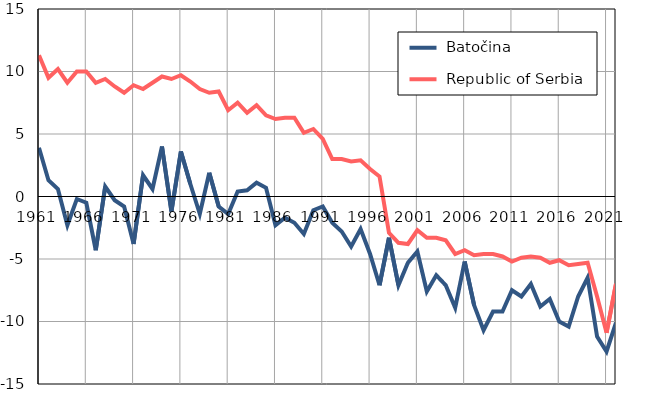
| Category |  Batočina |  Republic of Serbia |
|---|---|---|
| 1961.0 | 3.9 | 11.3 |
| 1962.0 | 1.3 | 9.5 |
| 1963.0 | 0.6 | 10.2 |
| 1964.0 | -2.3 | 9.1 |
| 1965.0 | -0.2 | 10 |
| 1966.0 | -0.5 | 10 |
| 1967.0 | -4.3 | 9.1 |
| 1968.0 | 0.8 | 9.4 |
| 1969.0 | -0.3 | 8.8 |
| 1970.0 | -0.8 | 8.3 |
| 1971.0 | -3.8 | 8.9 |
| 1972.0 | 1.7 | 8.6 |
| 1973.0 | 0.6 | 9.1 |
| 1974.0 | 4 | 9.6 |
| 1975.0 | -1.2 | 9.4 |
| 1976.0 | 3.6 | 9.7 |
| 1977.0 | 1 | 9.2 |
| 1978.0 | -1.4 | 8.6 |
| 1979.0 | 1.9 | 8.3 |
| 1980.0 | -0.8 | 8.4 |
| 1981.0 | -1.4 | 6.9 |
| 1982.0 | 0.4 | 7.5 |
| 1983.0 | 0.5 | 6.7 |
| 1984.0 | 1.1 | 7.3 |
| 1985.0 | 0.7 | 6.5 |
| 1986.0 | -2.3 | 6.2 |
| 1987.0 | -1.7 | 6.3 |
| 1988.0 | -2.1 | 6.3 |
| 1989.0 | -3 | 5.1 |
| 1990.0 | -1.1 | 5.4 |
| 1991.0 | -0.8 | 4.6 |
| 1992.0 | -2.1 | 3 |
| 1993.0 | -2.8 | 3 |
| 1994.0 | -4 | 2.8 |
| 1995.0 | -2.6 | 2.9 |
| 1996.0 | -4.6 | 2.2 |
| 1997.0 | -7.1 | 1.6 |
| 1998.0 | -3.3 | -2.9 |
| 1999.0 | -7.1 | -3.7 |
| 2000.0 | -5.3 | -3.8 |
| 2001.0 | -4.4 | -2.7 |
| 2002.0 | -7.6 | -3.3 |
| 2003.0 | -6.3 | -3.3 |
| 2004.0 | -7.1 | -3.5 |
| 2005.0 | -8.9 | -4.6 |
| 2006.0 | -5.2 | -4.3 |
| 2007.0 | -8.7 | -4.7 |
| 2008.0 | -10.7 | -4.6 |
| 2009.0 | -9.2 | -4.6 |
| 2010.0 | -9.2 | -4.8 |
| 2011.0 | -7.5 | -5.2 |
| 2012.0 | -8 | -4.9 |
| 2013.0 | -7 | -4.8 |
| 2014.0 | -8.8 | -4.9 |
| 2015.0 | -8.2 | -5.3 |
| 2016.0 | -10 | -5.1 |
| 2017.0 | -10.4 | -5.5 |
| 2018.0 | -8 | -5.4 |
| 2019.0 | -6.5 | -5.3 |
| 2020.0 | -11.2 | -8 |
| 2021.0 | -12.4 | -10.9 |
| 2022.0 | -10.1 | -7 |